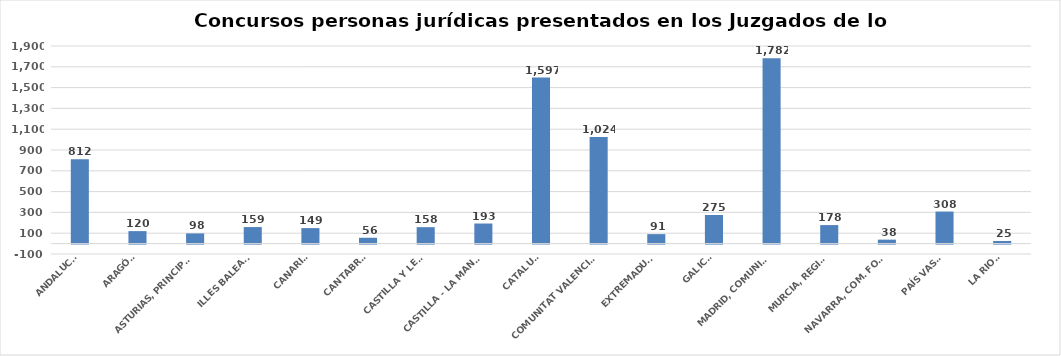
| Category | Series 0 |
|---|---|
| ANDALUCÍA | 812 |
| ARAGÓN | 120 |
| ASTURIAS, PRINCIPADO | 98 |
| ILLES BALEARS | 159 |
| CANARIAS | 149 |
| CANTABRIA | 56 |
| CASTILLA Y LEÓN | 158 |
| CASTILLA - LA MANCHA | 193 |
| CATALUÑA | 1597 |
| COMUNITAT VALENCIANA | 1024 |
| EXTREMADURA | 91 |
| GALICIA | 275 |
| MADRID, COMUNIDAD | 1782 |
| MURCIA, REGIÓN | 178 |
| NAVARRA, COM. FORAL | 38 |
| PAÍS VASCO | 308 |
| LA RIOJA | 25 |